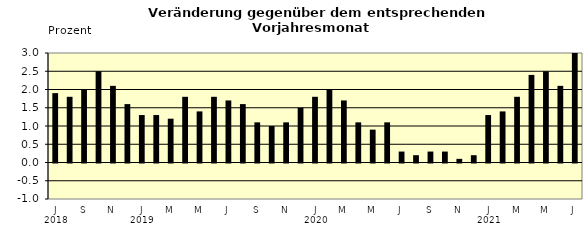
| Category | Series 0 |
|---|---|
| 0 | 1.9 |
| 1 | 1.8 |
| 2 | 2 |
| 3 | 2.5 |
| 4 | 2.1 |
| 5 | 1.6 |
| 6 | 1.3 |
| 7 | 1.3 |
| 8 | 1.2 |
| 9 | 1.8 |
| 10 | 1.4 |
| 11 | 1.8 |
| 12 | 1.7 |
| 13 | 1.6 |
| 14 | 1.1 |
| 15 | 1 |
| 16 | 1.1 |
| 17 | 1.5 |
| 18 | 1.8 |
| 19 | 2 |
| 20 | 1.7 |
| 21 | 1.1 |
| 22 | 0.9 |
| 23 | 1.1 |
| 24 | 0.3 |
| 25 | 0.2 |
| 26 | 0.3 |
| 27 | 0.3 |
| 28 | 0.1 |
| 29 | 0.2 |
| 30 | 1.3 |
| 31 | 1.4 |
| 32 | 1.8 |
| 33 | 2.4 |
| 34 | 2.5 |
| 35 | 2.1 |
| 36 | 3.7 |